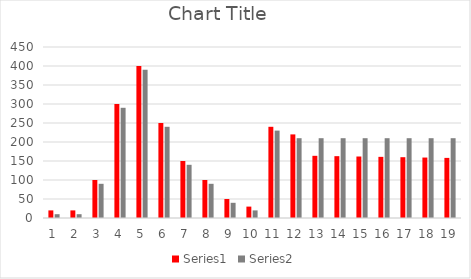
| Category | Series 0 | Series 1 |
|---|---|---|
| 0 | 20 | 10 |
| 1 | 20 | 10 |
| 2 | 100 | 90 |
| 3 | 300 | 290 |
| 4 | 400 | 390 |
| 5 | 250 | 240 |
| 6 | 150 | 140 |
| 7 | 100 | 90 |
| 8 | 50 | 40 |
| 9 | 30 | 20 |
| 10 | 240 | 230 |
| 11 | 220 | 210 |
| 12 | 163.636 | 210 |
| 13 | 162.727 | 210 |
| 14 | 161.818 | 210 |
| 15 | 160.909 | 210 |
| 16 | 160 | 210 |
| 17 | 159.091 | 210 |
| 18 | 158.182 | 210 |